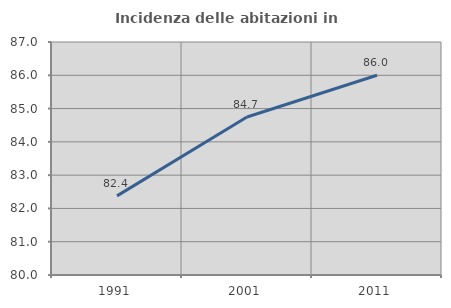
| Category | Incidenza delle abitazioni in proprietà  |
|---|---|
| 1991.0 | 82.377 |
| 2001.0 | 84.746 |
| 2011.0 | 86 |